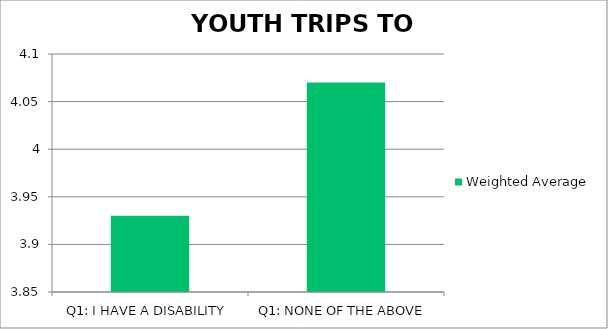
| Category | Weighted Average |
|---|---|
| Q1: I HAVE A DISABILITY | 3.93 |
| Q1: NONE OF THE ABOVE | 4.07 |